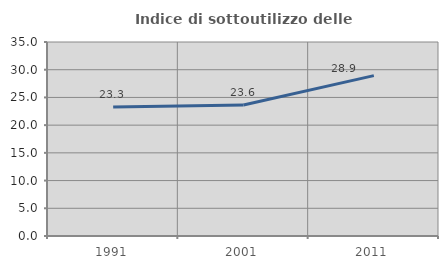
| Category | Indice di sottoutilizzo delle abitazioni  |
|---|---|
| 1991.0 | 23.253 |
| 2001.0 | 23.621 |
| 2011.0 | 28.937 |